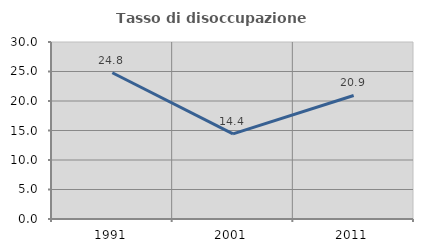
| Category | Tasso di disoccupazione giovanile  |
|---|---|
| 1991.0 | 24.786 |
| 2001.0 | 14.431 |
| 2011.0 | 20.936 |